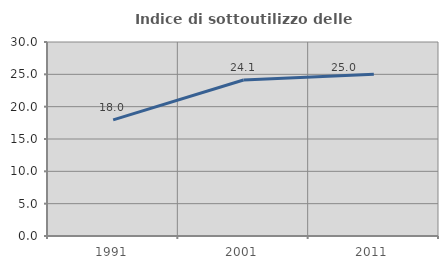
| Category | Indice di sottoutilizzo delle abitazioni  |
|---|---|
| 1991.0 | 17.959 |
| 2001.0 | 24.125 |
| 2011.0 | 25 |